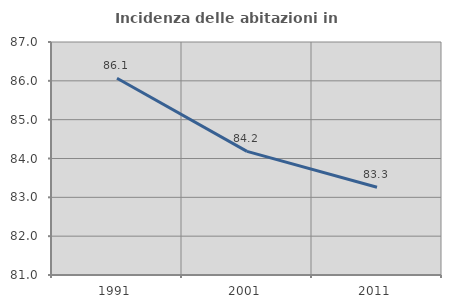
| Category | Incidenza delle abitazioni in proprietà  |
|---|---|
| 1991.0 | 86.066 |
| 2001.0 | 84.185 |
| 2011.0 | 83.259 |